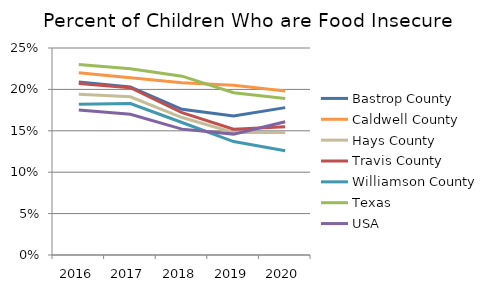
| Category | Bastrop County | Caldwell County | Hays County | Travis County | Williamson County | Texas | USA |
|---|---|---|---|---|---|---|---|
| 2016.0 | 0.209 | 0.22 | 0.194 | 0.207 | 0.182 | 0.23 | 0.175 |
| 2017.0 | 0.203 | 0.214 | 0.191 | 0.202 | 0.183 | 0.225 | 0.17 |
| 2018.0 | 0.176 | 0.208 | 0.166 | 0.172 | 0.16 | 0.216 | 0.152 |
| 2019.0 | 0.168 | 0.205 | 0.148 | 0.152 | 0.137 | 0.196 | 0.146 |
| 2020.0 | 0.178 | 0.198 | 0.148 | 0.155 | 0.126 | 0.189 | 0.161 |